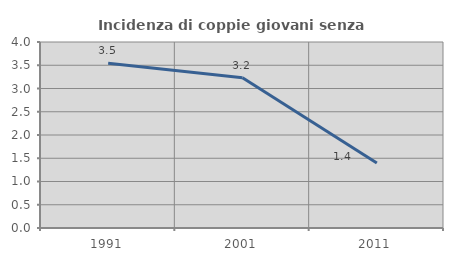
| Category | Incidenza di coppie giovani senza figli |
|---|---|
| 1991.0 | 3.541 |
| 2001.0 | 3.23 |
| 2011.0 | 1.396 |